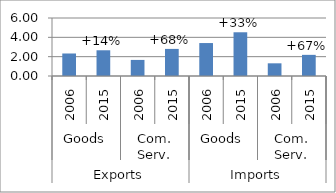
| Category | Trade flows |
|---|---|
| 0 | 2.329 |
| 1 | 2.662 |
| 2 | 1.663 |
| 3 | 2.802 |
| 4 | 3.409 |
| 5 | 4.524 |
| 6 | 1.312 |
| 7 | 2.188 |